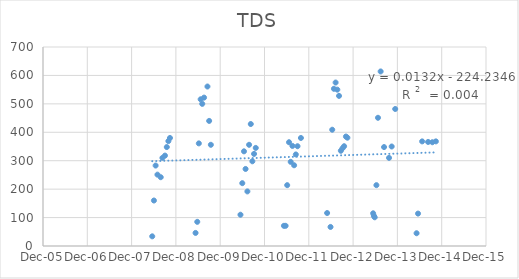
| Category | Series 0 |
|---|---|
| 39590.0 | 34 |
| 39604.0 | 160 |
| 39618.0 | 283 |
| 39633.0 | 251 |
| 39660.0 | 242 |
| 39674.0 | 310 |
| 39695.0 | 318 |
| 39710.0 | 348 |
| 39723.0 | 369 |
| 39736.0 | 380 |
| 39947.0 | 46 |
| 39961.0 | 85 |
| 39974.0 | 361 |
| 39989.0 | 516 |
| 40002.0 | 500 |
| 40017.0 | 522 |
| 40045.0 | 561 |
| 40059.0 | 440 |
| 40073.0 | 356 |
| 40317.0 | 110 |
| 40332.0 | 221 |
| 40346.0 | 333 |
| 40359.0 | 271 |
| 40374.0 | 192 |
| 40388.0 | 356 |
| 40402.0 | 429 |
| 40415.0 | 298 |
| 40429.0 | 324 |
| 40443.0 | 345 |
| 40675.0 | 71 |
| 40689.0 | 71 |
| 40702.0 | 214 |
| 40717.0 | 365 |
| 40731.0 | 296 |
| 40745.0 | 352 |
| 40759.0 | 284 |
| 40773.0 | 322 |
| 40787.0 | 351 |
| 40815.0 | 380 |
| 41031.0 | 116 |
| 41059.0 | 67 |
| 41073.0 | 409 |
| 41087.0 | 553 |
| 41101.0 | 575 |
| 41115.0 | 550 |
| 41129.0 | 528 |
| 41144.0 | 335 |
| 41158.0 | 344 |
| 41171.0 | 351 |
| 41186.0 | 385 |
| 41198.0 | 381 |
| 41410.0 | 115 |
| 41416.0 | 106 |
| 41423.0 | 101 |
| 41437.0 | 214 |
| 41450.0 | 451 |
| 41472.0 | 614 |
| 41500.0 | 348 |
| 41541.0 | 310 |
| 41563.0 | 350 |
| 41592.0 | 482 |
| 41768.0 | 44.9 |
| 41780.0 | 114 |
| 41814.0 | 368 |
| 41863.0 | 366 |
| 41898.0 | 365 |
| 41927.0 | 368 |